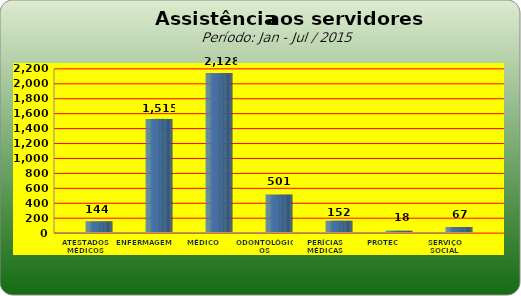
| Category | Series 0 |
|---|---|
| ATESTADOS MÉDICOS | 144 |
| ENFERMAGEM | 1515 |
| MÉDICO | 2128 |
| ODONTOLÓGICOS | 501 |
| PERÍCIAS MÉDICAS | 152 |
| PROTEC | 18 |
| SERVIÇO SOCIAL | 67 |